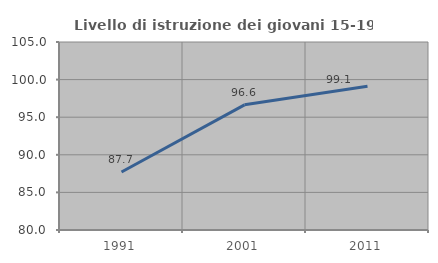
| Category | Livello di istruzione dei giovani 15-19 anni |
|---|---|
| 1991.0 | 87.72 |
| 2001.0 | 96.644 |
| 2011.0 | 99.107 |